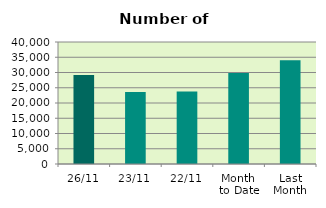
| Category | Series 0 |
|---|---|
| 26/11 | 29186 |
| 23/11 | 23590 |
| 22/11 | 23764 |
| Month 
to Date | 29863 |
| Last
Month | 34034.348 |